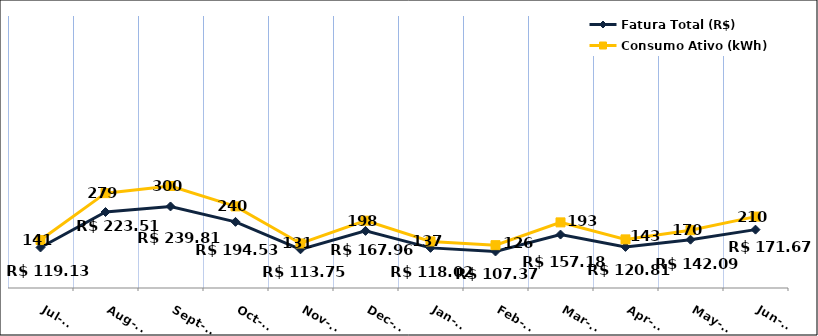
| Category | Fatura Total (R$) |
|---|---|
| 2023-07-01 | 119.13 |
| 2023-08-01 | 223.51 |
| 2023-09-01 | 239.81 |
| 2023-10-01 | 194.53 |
| 2023-11-01 | 113.75 |
| 2023-12-01 | 167.96 |
| 2024-01-01 | 118.02 |
| 2024-02-01 | 107.37 |
| 2024-03-01 | 157.18 |
| 2024-04-01 | 120.81 |
| 2024-05-01 | 142.09 |
| 2024-06-01 | 171.67 |